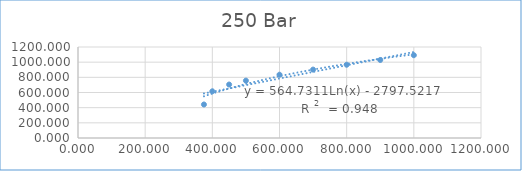
| Category | Series 0 |
|---|---|
| 375.0 | 441.806 |
| 400.0 | 616.006 |
| 450.0 | 704.873 |
| 500.0 | 756.307 |
| 600.0 | 834.568 |
| 700.0 | 902.054 |
| 800.0 | 966.03 |
| 900.0 | 1028.93 |
| 1000.0 | 1091.782 |